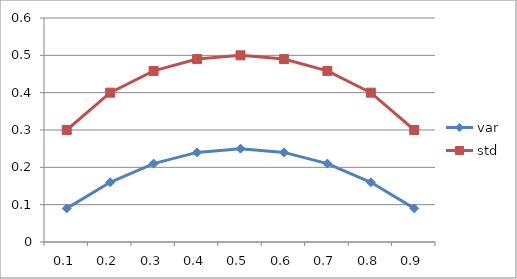
| Category | var | std |
|---|---|---|
| 0.1 | 0.09 | 0.3 |
| 0.2 | 0.16 | 0.4 |
| 0.3 | 0.21 | 0.458 |
| 0.4 | 0.24 | 0.49 |
| 0.5 | 0.25 | 0.5 |
| 0.6 | 0.24 | 0.49 |
| 0.7 | 0.21 | 0.458 |
| 0.8 | 0.16 | 0.4 |
| 0.9 | 0.09 | 0.3 |